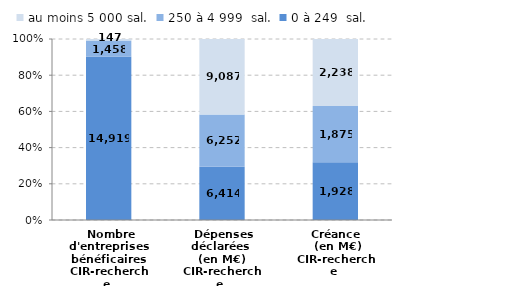
| Category | 0 à 249  sal. | 250 à 4 999  sal. | au moins 5 000 sal. |
|---|---|---|---|
| Nombre d'entreprises bénéficaires
CIR-recherche | 14919 | 1458 | 147 |
| Dépenses déclarées 
(en M€)
CIR-recherche | 6413.7 | 6252 | 9087.3 |
| Créance 
 (en M€)
CIR-recherche | 1928.1 | 1874.7 | 2237.8 |